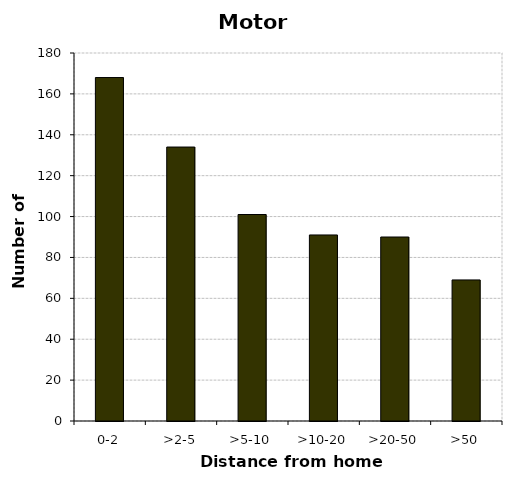
| Category | Motorcycles |
|---|---|
| 0-2 | 168 |
| >2-5 | 134 |
| >5-10 | 101 |
| >10-20 | 91 |
| >20-50 | 90 |
| >50 | 69 |